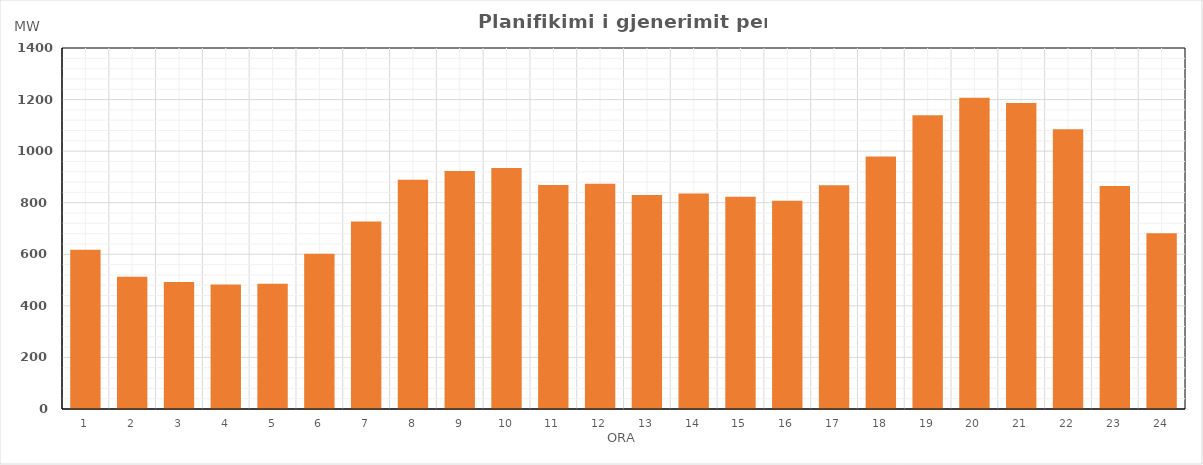
| Category | Max (MW) |
|---|---|
| 0 | 617.31 |
| 1 | 513.26 |
| 2 | 492.12 |
| 3 | 483.19 |
| 4 | 485.88 |
| 5 | 601.96 |
| 6 | 726.99 |
| 7 | 889.07 |
| 8 | 923.3 |
| 9 | 934.21 |
| 10 | 868.41 |
| 11 | 873.28 |
| 12 | 829.55 |
| 13 | 835.68 |
| 14 | 822.85 |
| 15 | 807.74 |
| 16 | 867.96 |
| 17 | 979.45 |
| 18 | 1139.24 |
| 19 | 1207.17 |
| 20 | 1186.52 |
| 21 | 1084.81 |
| 22 | 864.99 |
| 23 | 681.52 |